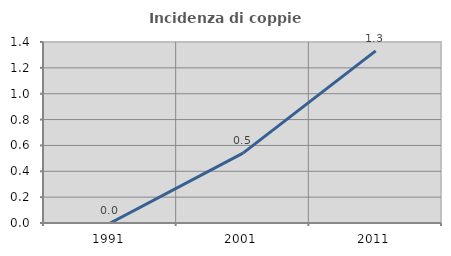
| Category | Incidenza di coppie miste |
|---|---|
| 1991.0 | 0 |
| 2001.0 | 0.541 |
| 2011.0 | 1.332 |